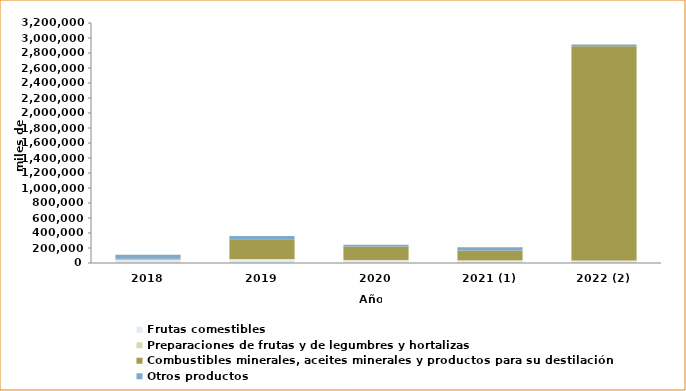
| Category | Frutas comestibles | Preparaciones de frutas y de legumbres y hortalizas | Combustibles minerales, aceites minerales y productos para su destilación | Otros productos |
|---|---|---|---|---|
| 2018 | 39457.07 | 6081.815 | 9817.102 | 53559.339 |
| 2019 | 45558.676 | 6185.551 | 264480.872 | 43574.705 |
| 2020 | 34162.6 | 5000.84 | 180994.525 | 23386.275 |
| 2021 (1) | 30908.119 | 6033.869 | 129101.779 | 44363.087 |
| 2022 (2) | 27217.069 | 6398.007 | 2854985.58 | 23669.714 |